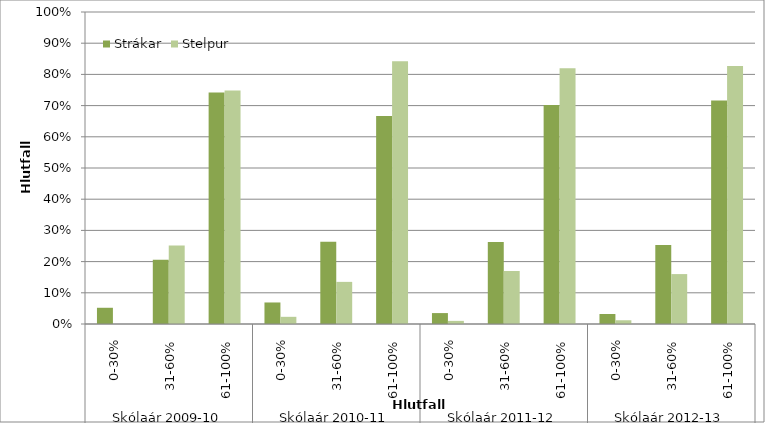
| Category | Strákar | Stelpur |
|---|---|---|
| 0 | 0.052 | 0 |
| 1 | 0.206 | 0.252 |
| 2 | 0.742 | 0.748 |
| 3 | 0.069 | 0.023 |
| 4 | 0.264 | 0.135 |
| 5 | 0.667 | 0.842 |
| 6 | 0.035 | 0.01 |
| 7 | 0.263 | 0.17 |
| 8 | 0.702 | 0.82 |
| 9 | 0.032 | 0.012 |
| 10 | 0.253 | 0.16 |
| 11 | 0.716 | 0.827 |